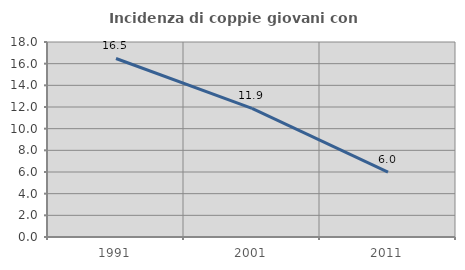
| Category | Incidenza di coppie giovani con figli |
|---|---|
| 1991.0 | 16.477 |
| 2001.0 | 11.879 |
| 2011.0 | 5.997 |